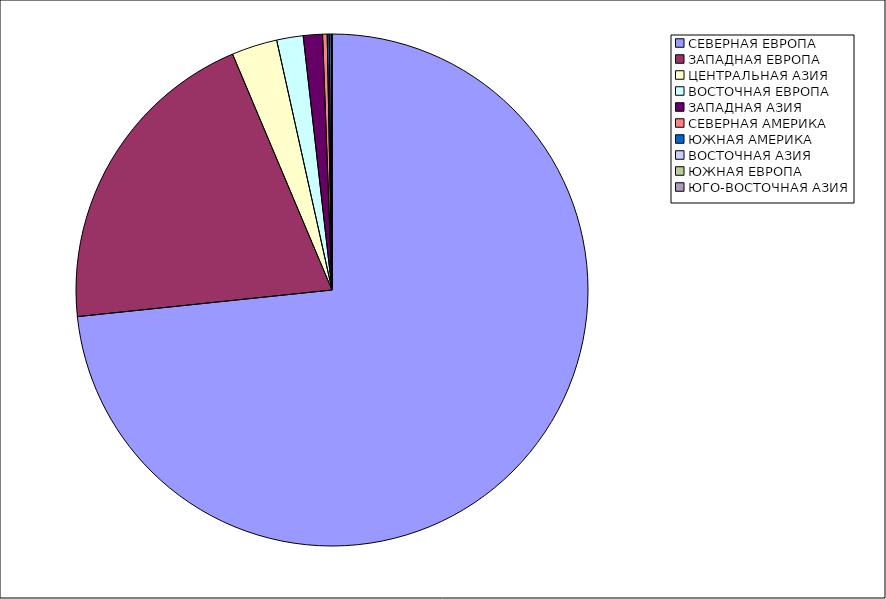
| Category | Оборот |
|---|---|
| СЕВЕРНАЯ ЕВРОПА | 73.34 |
| ЗАПАДНАЯ ЕВРОПА | 20.309 |
| ЦЕНТРАЛЬНАЯ АЗИЯ | 2.881 |
| ВОСТОЧНАЯ ЕВРОПА | 1.671 |
| ЗАПАДНАЯ АЗИЯ | 1.211 |
| СЕВЕРНАЯ АМЕРИКА | 0.287 |
| ЮЖНАЯ АМЕРИКА | 0.126 |
| ВОСТОЧНАЯ АЗИЯ | 0.116 |
| ЮЖНАЯ ЕВРОПА | 0.057 |
| ЮГО-ВОСТОЧНАЯ АЗИЯ | 0 |